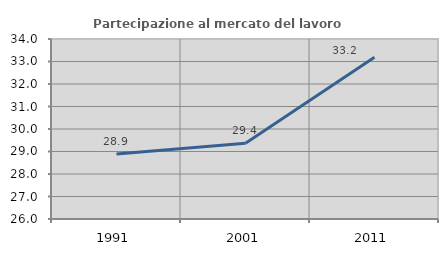
| Category | Partecipazione al mercato del lavoro  femminile |
|---|---|
| 1991.0 | 28.891 |
| 2001.0 | 29.371 |
| 2011.0 | 33.184 |